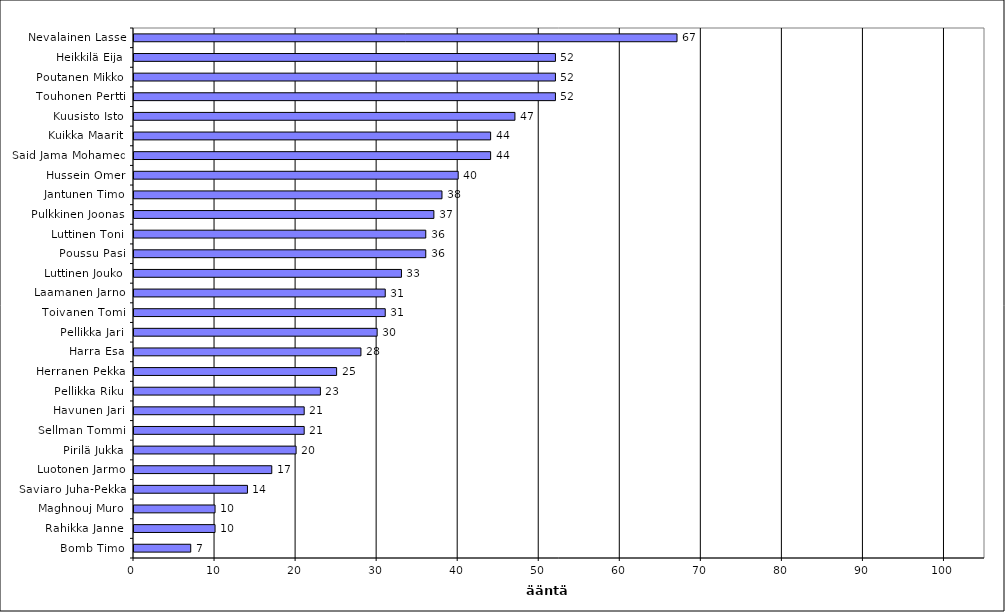
| Category | Series 0 |
|---|---|
| Nevalainen Lasse | 67 |
| Heikkilä Eija | 52 |
| Poutanen Mikko | 52 |
| Touhonen Pertti | 52 |
| Kuusisto Isto | 47 |
| Kuikka Maarit | 44 |
| Said Jama Mohamed | 44 |
| Hussein Omer | 40 |
| Jantunen Timo | 38 |
| Pulkkinen Joonas | 37 |
| Luttinen Toni | 36 |
| Poussu Pasi | 36 |
| Luttinen Jouko | 33 |
| Laamanen Jarno | 31 |
| Toivanen Tomi | 31 |
| Pellikka Jari | 30 |
| Harra Esa | 28 |
| Herranen Pekka | 25 |
| Pellikka Riku | 23 |
| Havunen Jari | 21 |
| Sellman Tommi | 21 |
| Pirilä Jukka | 20 |
| Luotonen Jarmo | 17 |
| Saviaro Juha-Pekka | 14 |
| Maghnouj Muro | 10 |
| Rahikka Janne | 10 |
| Bomb Timo | 7 |